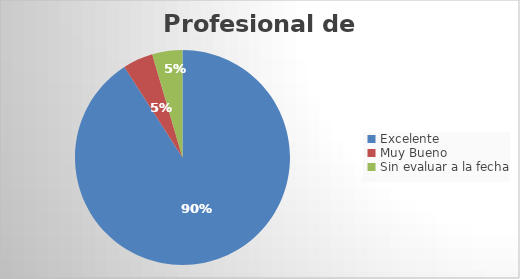
| Category | Cantidad |
|---|---|
| Excelente | 40 |
| Muy Bueno | 2 |
| Sin evaluar a la fecha | 2 |